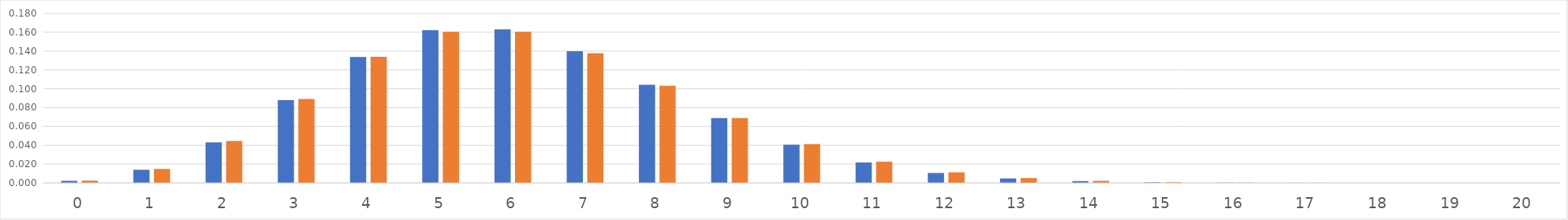
| Category | binom | Pőisson |
|---|---|---|
| 0.0 | 0.002 | 0.002 |
| 1.0 | 0.014 | 0.015 |
| 2.0 | 0.043 | 0.045 |
| 3.0 | 0.088 | 0.089 |
| 4.0 | 0.134 | 0.134 |
| 5.0 | 0.162 | 0.161 |
| 6.0 | 0.163 | 0.161 |
| 7.0 | 0.14 | 0.138 |
| 8.0 | 0.104 | 0.103 |
| 9.0 | 0.069 | 0.069 |
| 10.0 | 0.041 | 0.041 |
| 11.0 | 0.022 | 0.023 |
| 12.0 | 0.011 | 0.011 |
| 13.0 | 0.005 | 0.005 |
| 14.0 | 0.002 | 0.002 |
| 15.0 | 0.001 | 0.001 |
| 16.0 | 0 | 0 |
| 17.0 | 0 | 0 |
| 18.0 | 0 | 0 |
| 19.0 | 0 | 0 |
| 20.0 | 0 | 0 |